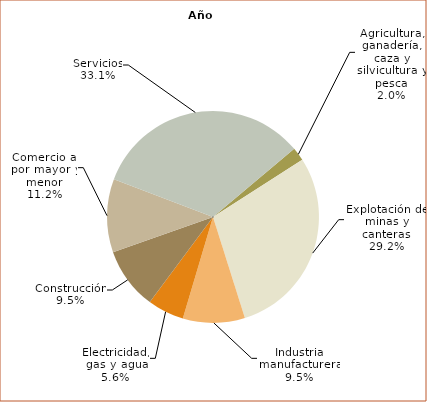
| Category | 2018 |
|---|---|
| Agricultura, ganadería, caza y silvicultura y pesca | 315918 |
| Explotación de minas y canteras | 4517749 |
| Industria manufacturera | 1463364 |
| Electricidad, gas y agua | 861494 |
| Construcción | 1463019 |
| Comercio al por mayor y menor | 1725746 |
| Servicios | 5122272 |